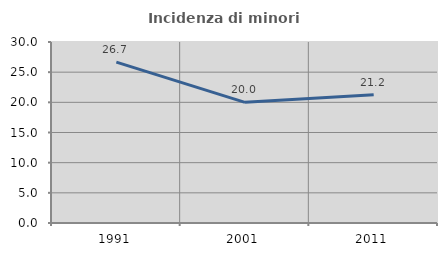
| Category | Incidenza di minori stranieri |
|---|---|
| 1991.0 | 26.667 |
| 2001.0 | 20 |
| 2011.0 | 21.245 |